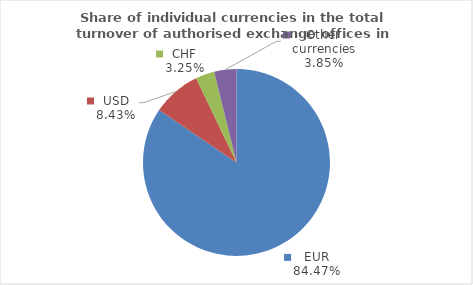
| Category | Series 0 |
|---|---|
| EUR | 84.472 |
| USD | 8.428 |
| CHF | 3.252 |
| Other currencies | 3.848 |